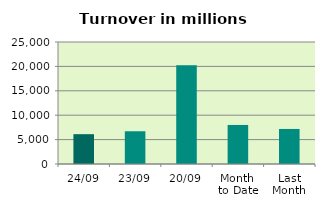
| Category | Series 0 |
|---|---|
| 24/09 | 6111.792 |
| 23/09 | 6710.165 |
| 20/09 | 20223.727 |
| Month 
to Date | 8000.482 |
| Last
Month | 7181.07 |